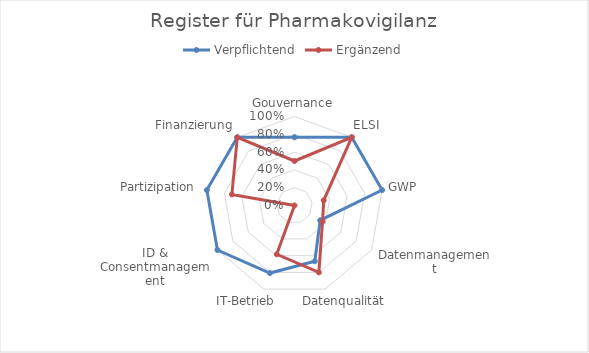
| Category | Verpflichtend | Ergänzend |
|---|---|---|
| Gouvernance | 0.767 | 0.5 |
| ELSI | 1 | 1 |
| GWP | 1 | 0.333 |
| Datenmanagement | 0.333 | 0.364 |
| Datenqualität | 0.667 | 0.8 |
| IT-Betrieb | 0.808 | 0.583 |
| ID & Consentmanagement | 1 | 0 |
| Partizipation | 1 | 0.714 |
| Finanzierung | 1 | 1 |